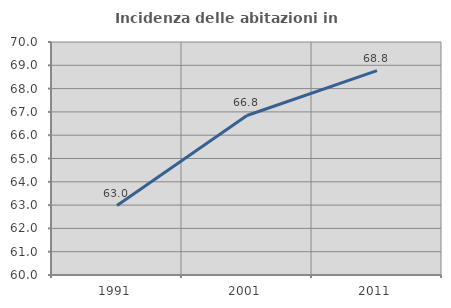
| Category | Incidenza delle abitazioni in proprietà  |
|---|---|
| 1991.0 | 62.979 |
| 2001.0 | 66.846 |
| 2011.0 | 68.772 |